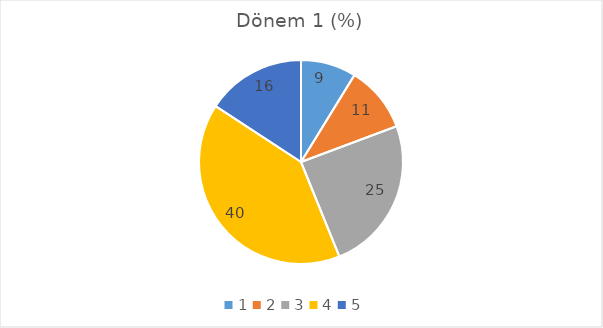
| Category | Dönem 1 (%) |
|---|---|
| 1.0 | 8.772 |
| 2.0 | 10.526 |
| 3.0 | 24.561 |
| 4.0 | 40.351 |
| 5.0 | 15.789 |